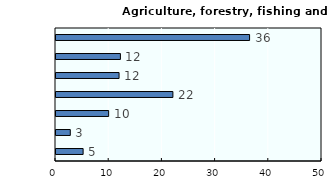
| Category | Agriculture, forestry, fishing and mining |
|---|---|
| Chamber of commerce | 5.097 |
| Female group | 2.686 |
| Group similar jobs | 9.895 |
| Industry group | 21.972 |
| Other | 11.855 |
| SME group | 12.108 |
| None | 36.387 |